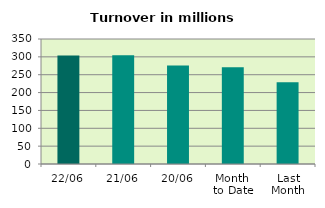
| Category | Series 0 |
|---|---|
| 22/06 | 303.897 |
| 21/06 | 304.693 |
| 20/06 | 275.674 |
| Month 
to Date | 270.914 |
| Last
Month | 228.645 |